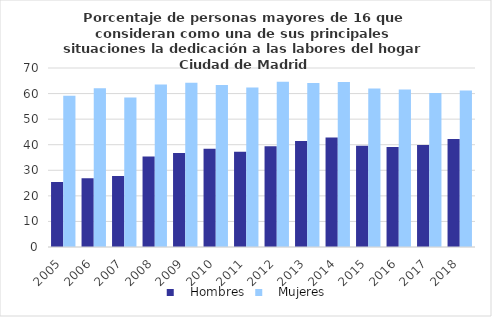
| Category |    Hombres |    Mujeres |
|---|---|---|
| 2005.0 | 25.4 | 59.103 |
| 2006.0 | 26.863 | 62.116 |
| 2007.0 | 27.808 | 58.424 |
| 2008.0 | 35.419 | 63.539 |
| 2009.0 | 36.765 | 64.266 |
| 2010.0 | 38.458 | 63.339 |
| 2011.0 | 37.212 | 62.351 |
| 2012.0 | 39.394 | 64.641 |
| 2013.0 | 41.41 | 64.176 |
| 2014.0 | 42.866 | 64.541 |
| 2015.0 | 39.609 | 61.944 |
| 2016.0 | 39.085 | 61.628 |
| 2017.0 | 39.86 | 60.206 |
| 2018.0 | 42.203 | 61.169 |